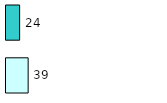
| Category | Series 0 | Series 1 |
|---|---|---|
| 0 | 39 | 24 |